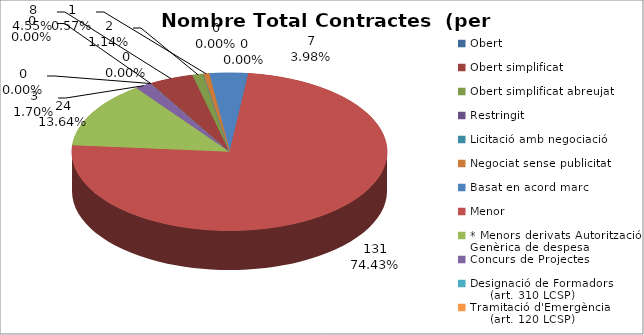
| Category | Nombre Total Contractes |
|---|---|
| Obert | 0 |
| Obert simplificat | 8 |
| Obert simplificat abreujat | 2 |
| Restringit | 0 |
| Licitació amb negociació | 0 |
| Negociat sense publicitat | 1 |
| Basat en acord marc | 7 |
| Menor | 131 |
| * Menors derivats Autorització Genèrica de despesa | 24 |
| Concurs de Projectes | 3 |
| Designació de Formadors
     (art. 310 LCSP) | 0 |
| Tramitació d'Emergència
     (art. 120 LCSP) | 0 |